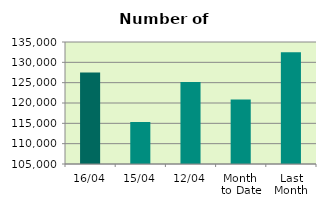
| Category | Series 0 |
|---|---|
| 16/04 | 127520 |
| 15/04 | 115328 |
| 12/04 | 125172 |
| Month 
to Date | 120831 |
| Last
Month | 132498.571 |